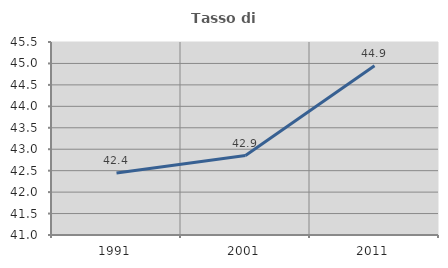
| Category | Tasso di occupazione   |
|---|---|
| 1991.0 | 42.448 |
| 2001.0 | 42.853 |
| 2011.0 | 44.945 |